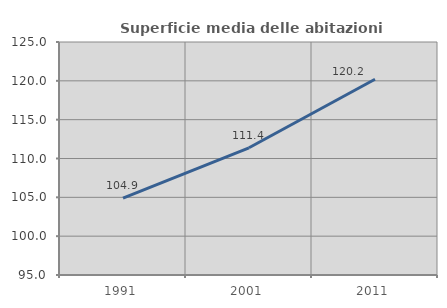
| Category | Superficie media delle abitazioni occupate |
|---|---|
| 1991.0 | 104.885 |
| 2001.0 | 111.382 |
| 2011.0 | 120.198 |